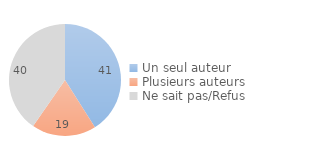
| Category | Series 0 |
|---|---|
| Un seul auteur | 41.04 |
| Plusieurs auteurs | 18.595 |
| Ne sait pas/Refus | 40.365 |